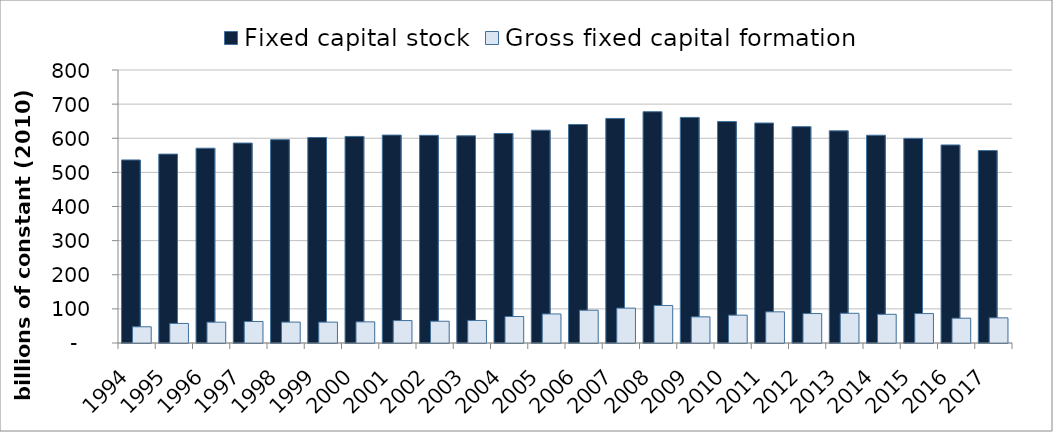
| Category | Fixed capital stock | Gross fixed capital formation |
|---|---|---|
| 1994.0 | 536.437 | 47.522 |
| 1995.0 | 553.501 | 57.292 |
| 1996.0 | 570.828 | 61.065 |
| 1997.0 | 585.855 | 62.94 |
| 1998.0 | 595.835 | 61.248 |
| 1999.0 | 602.178 | 61.204 |
| 2000.0 | 605.353 | 61.955 |
| 2001.0 | 609.266 | 65.737 |
| 2002.0 | 608.506 | 63.775 |
| 2003.0 | 607.06 | 66.058 |
| 2004.0 | 613.985 | 77.576 |
| 2005.0 | 623.506 | 85.104 |
| 2006.0 | 640.281 | 95.978 |
| 2007.0 | 658.046 | 102.16 |
| 2008.0 | 677.722 | 109.95 |
| 2009.0 | 661.067 | 76.564 |
| 2010.0 | 648.894 | 81.634 |
| 2011.0 | 644.635 | 91.323 |
| 2012.0 | 633.982 | 86.243 |
| 2013.0 | 621.699 | 87.067 |
| 2014.0 | 608.816 | 84.066 |
| 2015.0 | 599.593 | 86.252 |
| 2016.0 | 580.34 | 72.687 |
| 2017.0 | 563.976 | 73.697 |